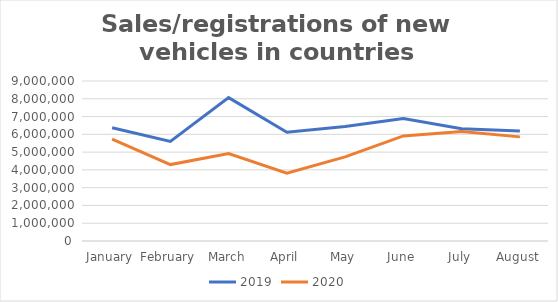
| Category | 2019 | 2020 |
|---|---|---|
| January | 6374173 | 5731591 |
| February | 5602858 | 4297691 |
| March | 8064294 | 4920918 |
| April | 6117562 | 3808755 |
| May | 6444926 | 4734962 |
| June | 6887312 | 5911081 |
| July | 6314118 | 6153883 |
| August | 6194172 | 5857286 |